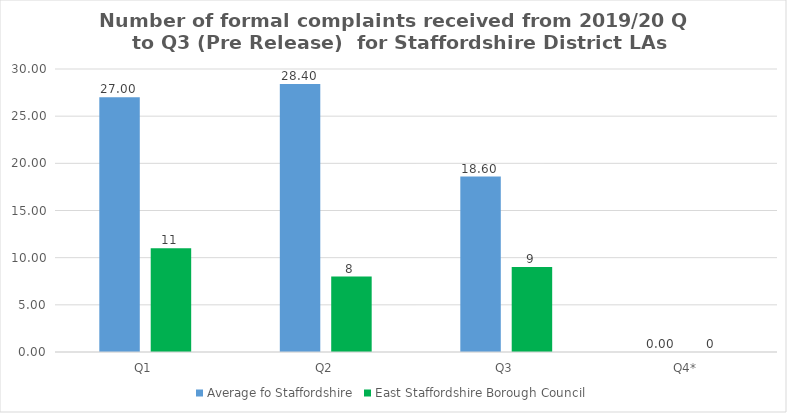
| Category | Average fo Staffordshire | East Staffordshire Borough Council |
|---|---|---|
| Q1 | 27 | 11 |
| Q2 | 28.4 | 8 |
| Q3 | 18.6 | 9 |
| Q4* | 0 | 0 |